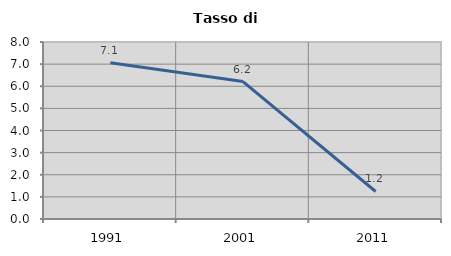
| Category | Tasso di disoccupazione   |
|---|---|
| 1991.0 | 7.063 |
| 2001.0 | 6.211 |
| 2011.0 | 1.244 |